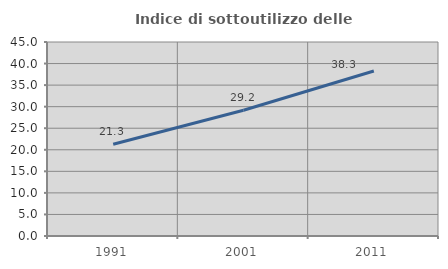
| Category | Indice di sottoutilizzo delle abitazioni  |
|---|---|
| 1991.0 | 21.291 |
| 2001.0 | 29.18 |
| 2011.0 | 38.262 |